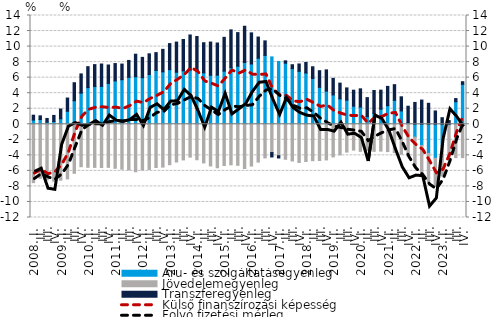
| Category | Áru- és szolgáltatásegyenleg | Jövedelemegyenleg | Transzferegyenleg |
|---|---|---|---|
| 2008. I. | 0.541 | -7.513 | 0.629 |
|          II. | 0.609 | -6.945 | 0.477 |
|          III. | 0.273 | -7.172 | 0.473 |
|          IV. | 0.346 | -7.33 | 0.793 |
| 2009. I. | 0.706 | -7.199 | 1.252 |
|          II. | 1.676 | -7.027 | 1.702 |
|          III. | 3.028 | -6.31 | 2.319 |
|          IV. | 4.008 | -5.461 | 2.475 |
| 2010. I. | 4.718 | -5.542 | 2.696 |
|          II. | 4.856 | -5.548 | 2.822 |
|          III. | 4.875 | -5.569 | 2.881 |
|          IV. | 5.259 | -5.545 | 2.37 |
| 2011. I. | 5.584 | -5.666 | 2.229 |
|          II. | 5.738 | -5.787 | 2.01 |
|          III. | 6.051 | -5.869 | 2.165 |
|          IV. | 6.114 | -6.109 | 2.905 |
| 2012. I. | 5.99 | -5.885 | 2.621 |
|          II. | 6.405 | -5.809 | 2.664 |
|          III. | 6.932 | -5.562 | 2.291 |
|          IV. | 6.749 | -5.515 | 2.895 |
| 2013. I. | 7.032 | -5.201 | 3.352 |
| II. | 6.701 | -4.855 | 3.878 |
|          III. | 6.881 | -4.589 | 4.034 |
| IV. | 6.971 | -4.23 | 4.522 |
| 2014. I. | 7.036 | -4.566 | 4.26 |
| II. | 6.623 | -4.977 | 3.871 |
|          III. | 6.307 | -5.364 | 4.275 |
| IV. | 6.316 | -5.599 | 4.145 |
| 2015. I. | 6.838 | -5.309 | 4.35 |
| II. | 7.308 | -5.216 | 4.842 |
|          III. | 7.477 | -5.283 | 4.32 |
| IV. | 7.943 | -5.693 | 4.673 |
| 2016. I. | 7.764 | -5.377 | 4.002 |
| II. | 8.503 | -4.87 | 2.723 |
|          III. | 8.868 | -4.329 | 1.866 |
| IV. | 8.672 | -3.641 | -0.569 |
| 2017. I. | 8.089 | -4.054 | -0.284 |
| II. | 7.862 | -4.508 | 0.303 |
|          III. | 7.163 | -4.725 | 0.502 |
| IV. | 6.82 | -4.916 | 0.941 |
| 2018. I. | 6.595 | -4.794 | 1.358 |
| II. | 5.894 | -4.689 | 1.507 |
|          III. | 4.759 | -4.663 | 2.139 |
| IV. | 4.267 | -4.589 | 2.734 |
| 2019. I. | 3.779 | -4.209 | 2.133 |
| II. | 3.274 | -3.932 | 2.02 |
|          III. | 3.104 | -3.581 | 1.576 |
| IV. | 2.324 | -3.326 | 2.062 |
| 2020. I. | 2.215 | -3.484 | 2.346 |
| II. | 0.977 | -3.362 | 2.454 |
|          III. | 1.407 | -3.484 | 2.94 |
| IV. | 1.938 | -3.452 | 2.452 |
| 2021. I. | 2.386 | -3.52 | 2.49 |
| II. | 3.082 | -3.646 | 2.018 |
|          III. | 1.721 | -3.862 | 1.813 |
| IV. | 0.203 | -4.107 | 2.119 |
| 2022. I. | -1.65 | -3.823 | 2.81 |
| II. | -2.731 | -3.68 | 3.117 |
|          III. | -3.749 | -3.683 | 2.701 |
| IV. | -4.383 | -3.621 | 1.713 |
| 2023. I. | -2.752 | -3.92 | 0.847 |
| II. | -0.106 | -4.169 | 0.479 |
|          III. | 2.903 | -4.293 | 0.405 |
| IV. | 5.136 | -4.29 | 0.343 |